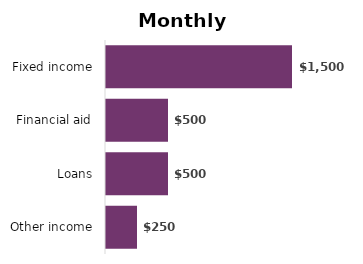
| Category | Amount |
|---|---|
| Fixed income | 1500 |
| Financial aid | 500 |
| Loans | 500 |
| Other income | 250 |